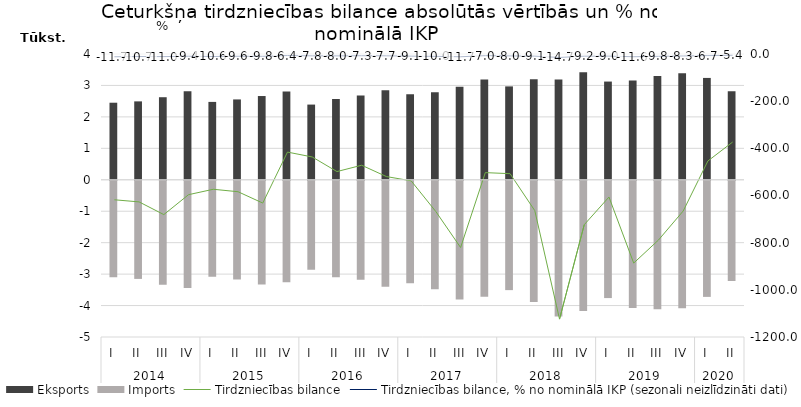
| Category | Eksports | Imports |
|---|---|---|
| 0 | 2450.7 | -3068.8 |
| 1 | 2493.4 | -3120.5 |
| 2 | 2625.5 | -3306.5 |
| 3 | 2816.7 | -3413.2 |
| 4 | 2476.5 | -3050.1 |
| 5 | 2555.2 | -3139.2 |
| 6 | 2663.4 | -3295.5 |
| 7 | 2809.5 | -3225.4 |
| 8 | 2391.5 | -2828.1 |
| 9 | 2569.5 | -3068 |
| 10 | 2678.2 | -3149.9 |
| 11 | 2850.8 | -3370.5 |
| 12 | 2719.6 | -3257.4 |
| 13 | 2783.8 | -3452 |
| 14 | 2956.9 | -3777.4 |
| 15 | 3187 | -3690 |
| 16 | 2969.9 | -3477.4 |
| 17 | 3193.3 | -3857.4 |
| 18 | 3189.7 | -4313.9 |
| 19 | 3420.5 | -4144.2 |
| 20 | 3123.6 | -3730.2 |
| 21 | 3158.2 | -4044.8 |
| 22 | 3298.5 | -4087.5 |
| 23 | 3385.3 | -4051.1 |
| 24 | 3239 | -3692.6 |
| 25 | 2812.4 | -3185.8 |